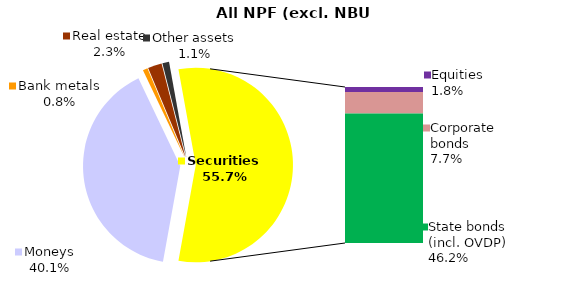
| Category | All NPF (excl. NBU CNPF) |
|---|---|
| Moneys | 487.385 |
| Bank metals | 9.746 |
| Real estate | 28.218 |
| Other assets | 13.524 |
| Equities | 21.562 |
| Corporate bonds | 93.856 |
| Municipal bonds | 0 |
| State bonds (incl. OVDP) | 562.26 |